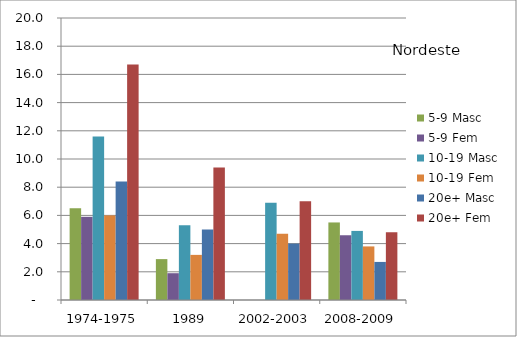
| Category | 5-9 Masc | 5-9 Fem | 10-19 Masc | 10-19 Fem | 20e+ Masc | 20e+ Fem |
|---|---|---|---|---|---|---|
| 1974-1975 | 6.5 | 5.9 | 11.6 | 6 | 8.4 | 16.7 |
| 1989 | 2.9 | 1.9 | 5.3 | 3.2 | 5 | 9.4 |
| 2002-2003 | 0 | 0 | 6.9 | 4.7 | 4 | 7 |
| 2008-2009 | 5.5 | 4.6 | 4.9 | 3.8 | 2.7 | 4.8 |